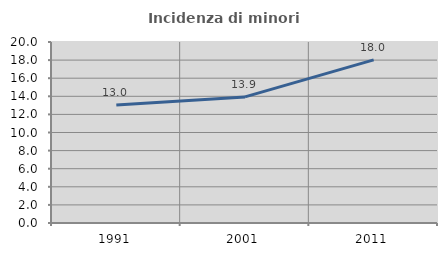
| Category | Incidenza di minori stranieri |
|---|---|
| 1991.0 | 13.043 |
| 2001.0 | 13.934 |
| 2011.0 | 18.024 |